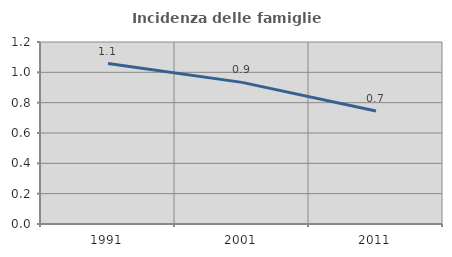
| Category | Incidenza delle famiglie numerose |
|---|---|
| 1991.0 | 1.058 |
| 2001.0 | 0.934 |
| 2011.0 | 0.745 |